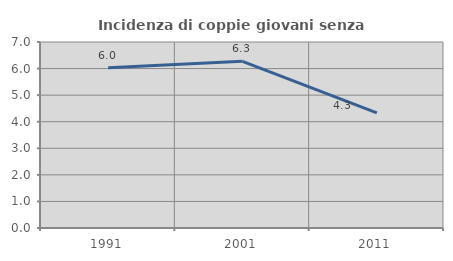
| Category | Incidenza di coppie giovani senza figli |
|---|---|
| 1991.0 | 6.028 |
| 2001.0 | 6.274 |
| 2011.0 | 4.332 |